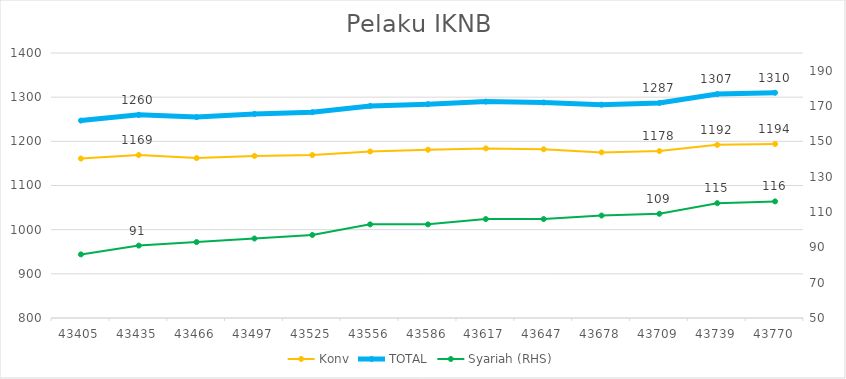
| Category | Konv | TOTAL |
|---|---|---|
| 43405.0 | 1161 | 1247 |
| 43435.0 | 1169 | 1260 |
| 43466.0 | 1162 | 1255 |
| 43497.0 | 1167 | 1262 |
| 43525.0 | 1169 | 1266 |
| 43556.0 | 1177 | 1280 |
| 43586.0 | 1181 | 1284 |
| 43617.0 | 1184 | 1290 |
| 43647.0 | 1182 | 1288 |
| 43678.0 | 1175 | 1283 |
| 43709.0 | 1178 | 1287 |
| 43739.0 | 1192 | 1307 |
| 43770.0 | 1194 | 1310 |